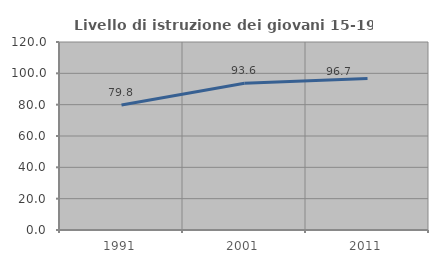
| Category | Livello di istruzione dei giovani 15-19 anni |
|---|---|
| 1991.0 | 79.844 |
| 2001.0 | 93.619 |
| 2011.0 | 96.737 |